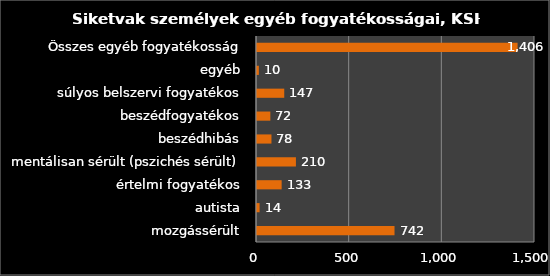
| Category | Series 0 |
|---|---|
| mozgássérült | 742 |
| autista | 14 |
| értelmi fogyatékos | 133 |
| mentálisan sérült (pszichés sérült) | 210 |
| beszédhibás | 78 |
| beszédfogyatékos | 72 |
| súlyos belszervi fogyatékos | 147 |
| egyéb | 10 |
| Összes egyéb fogyatékosság | 1406 |